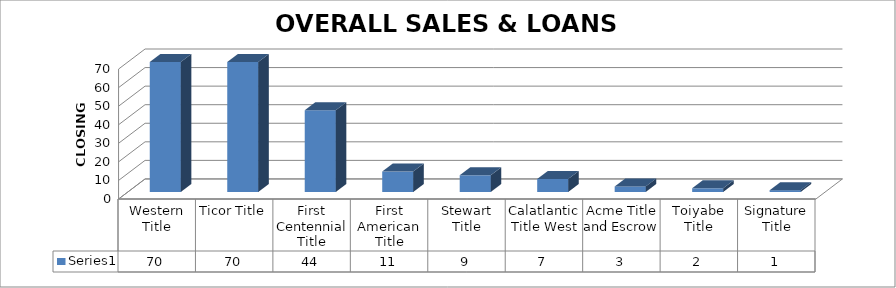
| Category | Series 0 |
|---|---|
| Western Title | 70 |
| Ticor Title | 70 |
| First Centennial Title | 44 |
| First American Title | 11 |
| Stewart Title | 9 |
| Calatlantic Title West | 7 |
| Acme Title and Escrow | 3 |
| Toiyabe Title | 2 |
| Signature Title | 1 |